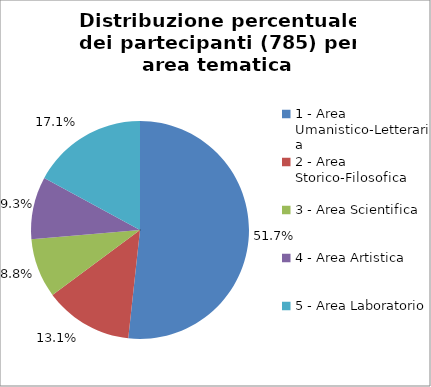
| Category | Nr. Partecipanti |
|---|---|
| 1 - Area Umanistico-Letteraria | 406 |
| 2 - Area Storico-Filosofica | 103 |
| 3 - Area Scientifica | 69 |
| 4 - Area Artistica | 73 |
| 5 - Area Laboratorio | 134 |